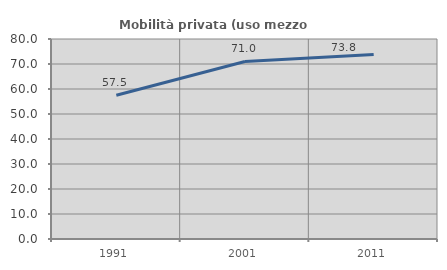
| Category | Mobilità privata (uso mezzo privato) |
|---|---|
| 1991.0 | 57.509 |
| 2001.0 | 71.011 |
| 2011.0 | 73.761 |